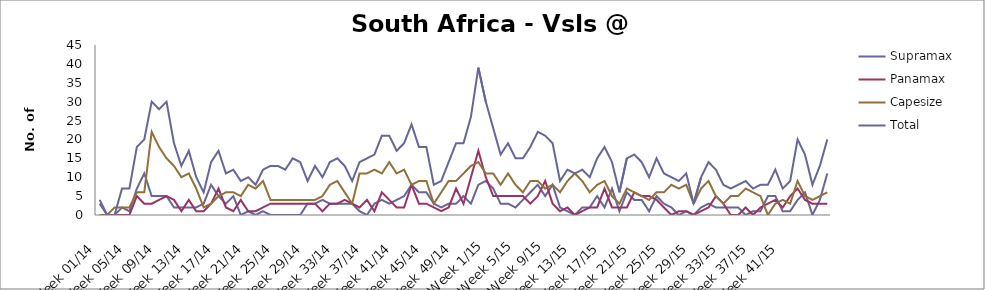
| Category | Supramax | Panamax | Capesize | Total |
|---|---|---|---|---|
| Week 01/14 | 3 | 0 | 0 | 4 |
| Week 02/14 | 0 | 0 | 0 | 0 |
| Week 03/14 | 0 | 0 | 2 | 0 |
| Week 04/14 | 2 | 0 | 2 | 7 |
| Week 05/14 | 1 | 0 | 2 | 7 |
| Week 06/14 | 7 | 5 | 6 | 18 |
| Week 07/14 | 11 | 3 | 6 | 20 |
| Week 08/14 | 5 | 3 | 22 | 30 |
| Week 09/14 | 5 | 4 | 18 | 28 |
| Week 10/14 | 5 | 5 | 15 | 30 |
| Week 11/14 | 2 | 4 | 13 | 19 |
| Week 12/14 | 2 | 1 | 10 | 13 |
| Week 13/14 | 2 | 4 | 11 | 17 |
| Week 14/14 | 2 | 1 | 7 | 10 |
| Week 15/14 | 3 | 1 | 2 | 6 |
| Week 16/14 | 8 | 3 | 3 | 14 |
| Week 17/14 | 5 | 7 | 5 | 17 |
| Week 18/14 | 3 | 2 | 6 | 11 |
| Week 19/14 | 5 | 1 | 6 | 12 |
| Week 20/14 | 0 | 4 | 5 | 9 |
| Week 21/14 | 1 | 1 | 8 | 10 |
| Week 22/14 | 0 | 1 | 7 | 8 |
| Week 23/14 | 1 | 2 | 9 | 12 |
| Week 24/14 | 0 | 3 | 4 | 13 |
| Week 25/14 | 0 | 3 | 4 | 13 |
| Week 26/14 | 0 | 3 | 4 | 12 |
| Week 27/14 | 0 | 3 | 4 | 15 |
| Week 28/14 | 0 | 3 | 4 | 14 |
| Week 29/14 | 3 | 3 | 4 | 9 |
| Week 30/14 | 3 | 3 | 4 | 13 |
| Week 31/14 | 4 | 1 | 5 | 10 |
| Week 32/14 | 3 | 3 | 8 | 14 |
| Week 33/14 | 3 | 3 | 9 | 15 |
| Week 34/14 | 3 | 4 | 6 | 13 |
| Week 35/14 | 3 | 3 | 3 | 9 |
| Week 36/14 | 1 | 2 | 11 | 14 |
| Week 37/14 | 0 | 4 | 11 | 15 |
| Week 38/14 | 3 | 1 | 12 | 16 |
| Week 39/14 | 4 | 6 | 11 | 21 |
| Week 40/14 | 3 | 4 | 14 | 21 |
| Week 41/14 | 4 | 2 | 11 | 17 |
| Week 42/14 | 5 | 2 | 12 | 19 |
| Week 43/14 | 8 | 8 | 8 | 24 |
| Week 44/14 | 6 | 3 | 9 | 18 |
| Week 45/14 | 6 | 3 | 9 | 18 |
| Week 46/14 | 3 | 2 | 3 | 8 |
| Week 47/14 | 2 | 1 | 6 | 9 |
| Week 48/14 | 3 | 2 | 9 | 14 |
| Week 49/14 | 3 | 7 | 9 | 19 |
| Week 50/14 | 5 | 3 | 11 | 19 |
| Week 51/14 | 3 | 10 | 13 | 26 |
| Week 52/14 | 8 | 17 | 14 | 39 |
| Week 1/15 | 9 | 10 | 11 | 30 |
| Week 2/15 | 7 | 5 | 11 | 23 |
| Week 3/15 | 3 | 5 | 8 | 16 |
| Week 4/15 | 3 | 5 | 11 | 19 |
| Week 5/15 | 2 | 5 | 8 | 15 |
| Week 6/15 | 4 | 5 | 6 | 15 |
| Week 7/15 | 6 | 3 | 9 | 18 |
| Week 8/15 | 8 | 5 | 9 | 22 |
| Week 9/15 | 5 | 9 | 7 | 21 |
| Week 10/15 | 8 | 3 | 8 | 19 |
| Week 11/15 | 2 | 1 | 6 | 9 |
| Week 12/15 | 1 | 2 | 9 | 12 |
| Week 13/15 | 0 | 0 | 11 | 11 |
| Week 14/15 | 2 | 1 | 9 | 12 |
| Week 15/15 | 2 | 2 | 6 | 10 |
| Week 16/15 | 5 | 2 | 8 | 15 |
| Week 17/15 | 2 | 7 | 9 | 18 |
| Week 18/15 | 7 | 2 | 5 | 14 |
| Week 19/15 | 1 | 2 | 3 | 6 |
| Week 20/15 | 6 | 2 | 7 | 15 |
| Week 21/15 | 4 | 6 | 6 | 16 |
| Week 22/15 | 4 | 5 | 5 | 14 |
| Week 23/15 | 1 | 5 | 4 | 10 |
| Week 24/15 | 5 | 4 | 6 | 15 |
| Week 25/15 | 3 | 2 | 6 | 11 |
| Week 26/15 | 2 | 0 | 8 | 10 |
| Week 27/15 | 0 | 1 | 7 | 9 |
| Week 28/15 | 1 | 1 | 8 | 11 |
| Week 29/15 | 0 | 0 | 3 | 3 |
| Week 30/15 | 2 | 1 | 7 | 10 |
| Week 31/15 | 3 | 2 | 9 | 14 |
| Week 32/15 | 2 | 5 | 5 | 12 |
| Week 33/15 | 2 | 3 | 3 | 8 |
| Week 34/15 | 2 | 0 | 5 | 7 |
| Week 35/15 | 2 | 0 | 5 | 8 |
| Week 36/15 | 0 | 2 | 7 | 9 |
| Week 37/15 | 1 | 0 | 6 | 7 |
| Week 38/15 | 1 | 2 | 5 | 8 |
| Week 39/15 | 5 | 3 | 0 | 8 |
| Week 40/15 | 5 | 4 | 3 | 12 |
| Week 41/15 | 1 | 2 | 4 | 7 |
| Week 42/15 | 1 | 5 | 3 | 9 |